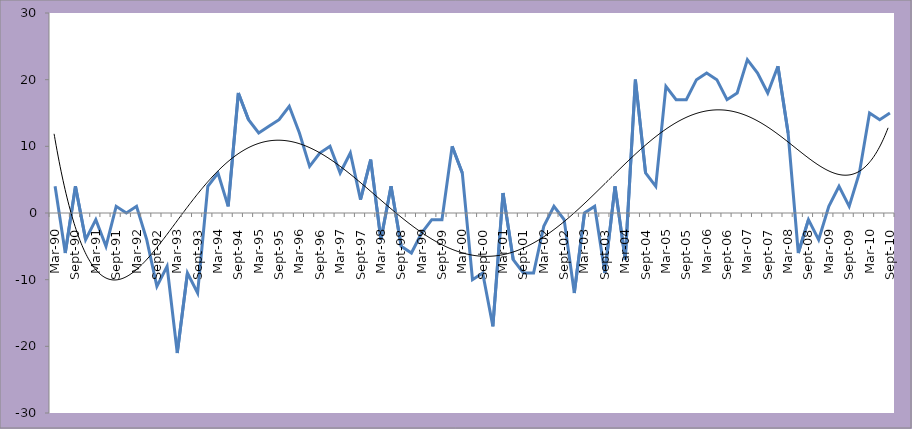
| Category | FNB/BER Consumer Confidence Index |
|---|---|
| Mar-90 | 4 |
| Jun-90 | -6 |
| Sep-90 | 4 |
| Dec-90 | -4 |
| Mar-91 | -1 |
| Jun-91 | -5 |
| Sep-91 | 1 |
| Dec-91 | 0 |
| Mar-92 | 1 |
| Jun-92 | -4 |
| Sep-92 | -11 |
| Dec-92 | -8 |
| Mar-93 | -21 |
| Jun-93 | -9 |
| Sep-93 | -12 |
| Dec-93 | 4 |
| Mar-94 | 6 |
| Jun-94 | 1 |
| Sep-94 | 18 |
| Dec-94 | 14 |
| Mar-95 | 12 |
| Jun-95 | 13 |
| Sep-95 | 14 |
| Dec-95 | 16 |
| Mar-96 | 12 |
| Jun-96 | 7 |
| Sep-96 | 9 |
| Dec-96 | 10 |
| Mar-97 | 6 |
| Jun-97 | 9 |
| Sep-97 | 2 |
| Dec-97 | 8 |
| Mar-98 | -4 |
| Jun-98 | 4 |
| Sep-98 | -5 |
| Dec-98 | -6 |
| Mar-99 | -3 |
| Jun-99 | -1 |
| Sep-99 | -1 |
| Dec-99 | 10 |
| Mar-00 | 6 |
| Jun-00 | -10 |
| Sep-00 | -9 |
| Dec-00 | -17 |
| Mar-01 | 3 |
| Jun-01 | -7 |
| Sep-01 | -9 |
| Dec-01 | -9 |
| Mar-02 | -2 |
| Jun-02 | 1 |
| Sep-02 | -1 |
| Dec-02 | -12 |
| Mar-03 | 0 |
| Jun-03 | 1 |
| Sep-03 | -9 |
| Dec-03 | 4 |
| Mar-04 | -7 |
| Jun-04 | 20 |
| Sep-04 | 6 |
| Dec-04 | 4 |
| Mar-05 | 19 |
| Jun-05 | 17 |
| Sep-05 | 17 |
| Dec-05 | 20 |
| Mar-06 | 21 |
| Jun-06 | 20 |
| Sep-06 | 17 |
| Dec-06 | 18 |
| Mar-07 | 23 |
| Jun-07 | 21 |
| Sep-07 | 18 |
| Dec-07 | 22 |
| Mar-08 | 12 |
| Jun-08 | -6 |
| Sep-08 | -1 |
| Dec-08 | -4 |
| Mar-09 | 1 |
| Jun-09 | 4 |
| Sep-09 | 1 |
| Dec-09 | 6 |
| Mar-10 | 15 |
| Jun-10 | 14 |
| Sep-10 | 15 |